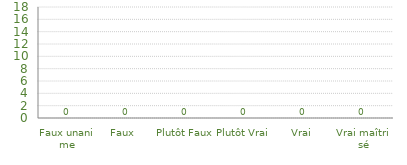
| Category | Histogramme de Véracité des Processus
Réalisation |
|---|---|
| Faux unanime | 0 |
| Faux  | 0 |
| Plutôt Faux | 0 |
| Plutôt Vrai | 0 |
| Vrai  | 0 |
| Vrai maîtrisé | 0 |